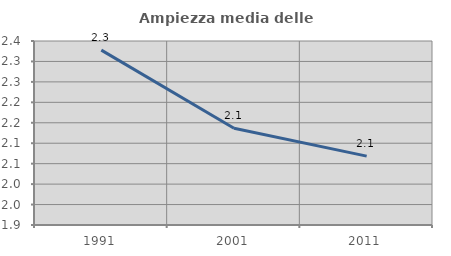
| Category | Ampiezza media delle famiglie |
|---|---|
| 1991.0 | 2.328 |
| 2001.0 | 2.137 |
| 2011.0 | 2.068 |